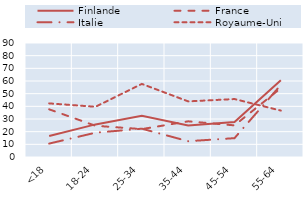
| Category | Finlande | France | Italie | Royaume-Uni |
|---|---|---|---|---|
| <18 | 16.59 | 37.63 | 10.6 | 42.32 |
| 18-24 | 25.74 | 24.65 | 19.18 | 39.66 |
| 25-34 | 32.58 | 22.02 | 22.35 | 57.7 |
| 35-44 | 24.91 | 28.16 | 12.46 | 43.91 |
| 45-54 | 27.56 | 24.97 | 14.88 | 45.75 |
| 55-64 | 60.68 | 54.35 | 56.86 | 36.65 |